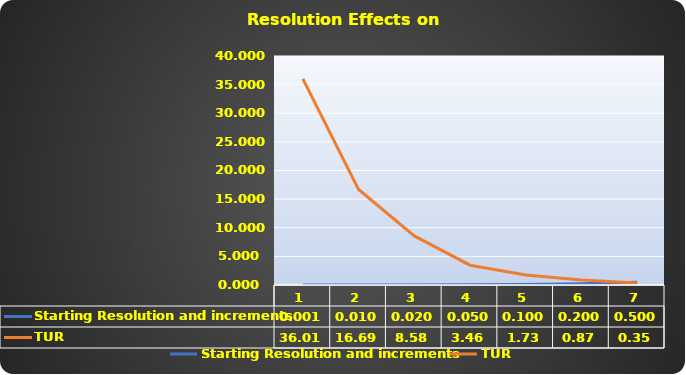
| Category | Starting Resolution and increments | TUR |
|---|---|---|
| 0 | 0.001 | 36.009 |
| 1 | 0.01 | 16.691 |
| 2 | 0.02 | 8.578 |
| 3 | 0.05 | 3.459 |
| 4 | 0.1 | 1.731 |
| 5 | 0.2 | 0.866 |
| 6 | 0.5 | 0.346 |